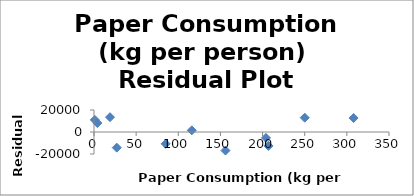
| Category | Series 0 |
|---|---|
| 1.0 | 11019.985 |
| 85.0 | -10761.166 |
| 204.0 | -5366.89 |
| 250.0 | 12986.859 |
| 4.0 | 8149.96 |
| 156.0 | -16837.706 |
| 19.0 | 13455.127 |
| 116.0 | 1516.622 |
| 207.0 | -12649.478 |
| 308.0 | 12717.502 |
| 27.0 | -14230.815 |